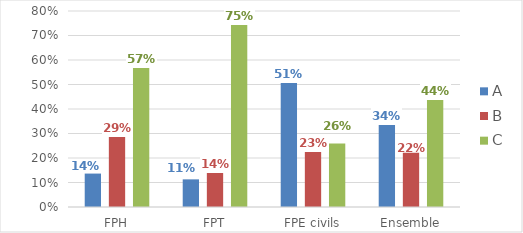
| Category | A | B | C |
|---|---|---|---|
| FPH | 0.136 | 0.292 | 0.572 |
| FPT | 0.113 | 0.142 | 0.745 |
| FPE civils | 0.511 | 0.23 | 0.259 |
| Ensemble | 0.339 | 0.221 | 0.439 |